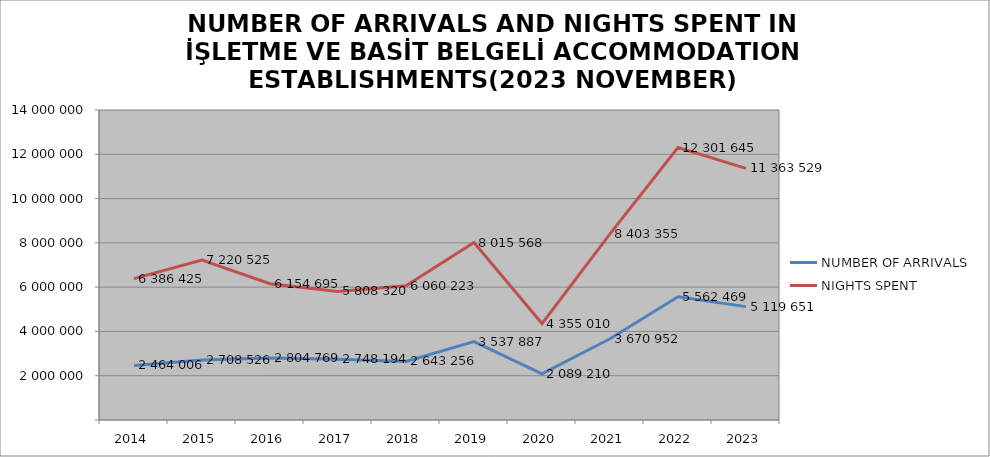
| Category | NUMBER OF ARRIVALS | NIGHTS SPENT |
|---|---|---|
| 2014 | 2464006 | 6386425 |
| 2015 | 2708526 | 7220525 |
| 2016 | 2804769 | 6154695 |
| 2017 | 2748194 | 5808320 |
| 2018 | 2643256 | 6060223 |
| 2019 | 3537887 | 8015568 |
| 2020 | 2089210 | 4355010 |
| 2021 | 3670952 | 8403355 |
| 2022 | 5562469 | 12301645 |
| 2023 | 5119651 | 11363529 |